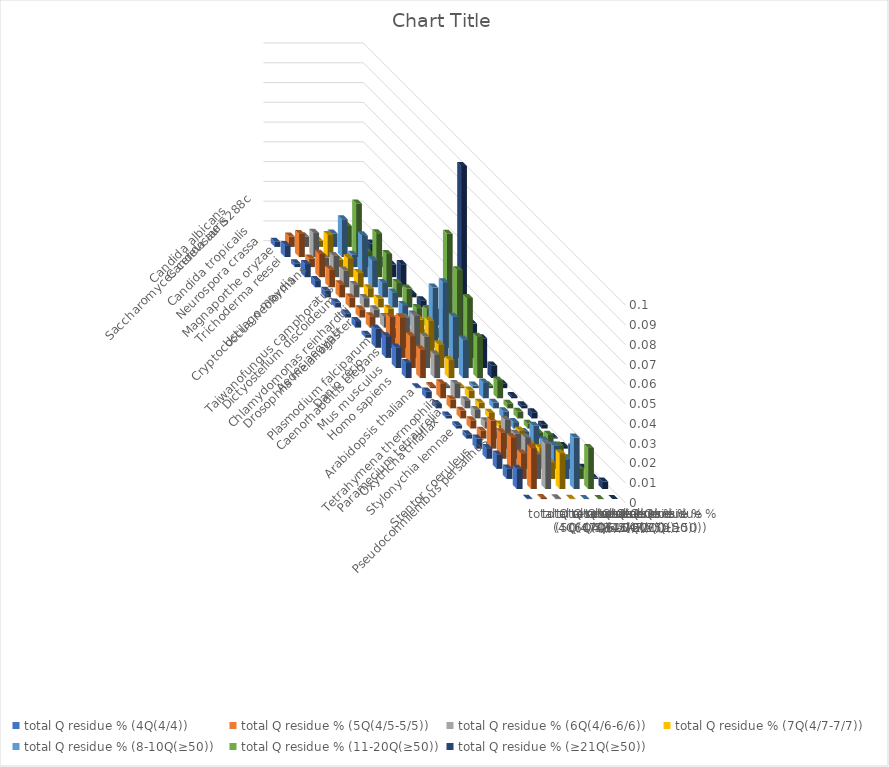
| Category | total Q residue % (4Q(4/4)) | total Q residue % (5Q(4/5-5/5)) | total Q residue % (6Q(4/6-6/6)) | total Q residue % (7Q(4/7-7/7)) | total Q residue % (8-10Q(≥50)) | total Q residue % (11-20Q(≥50)) | total Q residue % (≥21Q(≥50)) |
|---|---|---|---|---|---|---|---|
| Saccharomyces cerevisiae S288c | 0.003 | 0.005 | 0.005 | 0.003 | 0.007 | 0.011 | 0.005 |
| Candida albicans | 0.006 | 0.012 | 0.012 | 0.011 | 0.019 | 0.027 | 0.007 |
| Candida auris | 0.002 | 0.004 | 0.005 | 0.004 | 0.006 | 0.008 | 0.003 |
| Candida tropicalis | 0.007 | 0.012 | 0.011 | 0.01 | 0.021 | 0.022 | 0.006 |
| Neurospora crassa | 0.004 | 0.009 | 0.008 | 0.007 | 0.014 | 0.017 | 0.012 |
| Magnaporthe oryzae | 0.003 | 0.007 | 0.006 | 0.005 | 0.007 | 0.007 | 0.002 |
| Trichoderma reesei | 0.002 | 0.005 | 0.005 | 0.004 | 0.008 | 0.01 | 0.004 |
| Cryptococcus neoformans | 0.002 | 0.004 | 0.004 | 0.004 | 0.006 | 0.005 | 0.004 |
| Ustilago maydis | 0.003 | 0.006 | 0.005 | 0.004 | 0.007 | 0.009 | 0.008 |
| Taiwanofungus camphoratus | 0.002 | 0.002 | 0.003 | 0.003 | 0.002 | 0.003 | 0.001 |
| Dictyostelium discoideum | 0.01 | 0.016 | 0.015 | 0.014 | 0.03 | 0.058 | 0.092 |
| Chlamydomonas reinhardtii | 0.011 | 0.021 | 0.021 | 0.019 | 0.038 | 0.044 | 0.017 |
| Drosophila melanogaster | 0.01 | 0.016 | 0.016 | 0.012 | 0.026 | 0.035 | 0.015 |
| Aedes aegypti | 0.008 | 0.014 | 0.012 | 0.009 | 0.02 | 0.021 | 0.006 |
| Plasmodium falciparum | 0 | 0.001 | 0.001 | 0.001 | 0.001 | 0.001 | 0.002 |
| Caenorhabditis elegans | 0.003 | 0.008 | 0.007 | 0.004 | 0.008 | 0.009 | 0.001 |
| Danio rerio | 0.002 | 0.005 | 0.004 | 0.003 | 0.003 | 0.002 | 0.001 |
| Mus musculus | 0.001 | 0.004 | 0.004 | 0.003 | 0.004 | 0.003 | 0.003 |
| Homo sapiens | 0.002 | 0.004 | 0.004 | 0.002 | 0.003 | 0.002 | 0.002 |
| Arabidopsis thaliana | 0.002 | 0.004 | 0.004 | 0.003 | 0.003 | 0.003 | 0.001 |
| Tetrahymena thermophila | 0.005 | 0.014 | 0.015 | 0.009 | 0.012 | 0.007 | 0.001 |
| Paramecium tetraurelia | 0.005 | 0.013 | 0.013 | 0.008 | 0.009 | 0.007 | 0.006 |
| Oxytricha trifallax | 0.007 | 0.016 | 0.016 | 0.011 | 0.012 | 0.005 | 0.001 |
| Stylonychia lemnae | 0.005 | 0.013 | 0.013 | 0.008 | 0.01 | 0.005 | 0.001 |
| Pseudocohnilembus persalinus | 0.01 | 0.021 | 0.023 | 0.018 | 0.026 | 0.021 | 0.004 |
| Stentor coeruleus | 0 | 0.001 | 0 | 0 | 0 | 0 | 0 |